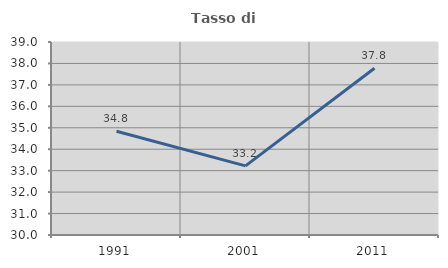
| Category | Tasso di occupazione   |
|---|---|
| 1991.0 | 34.836 |
| 2001.0 | 33.224 |
| 2011.0 | 37.776 |